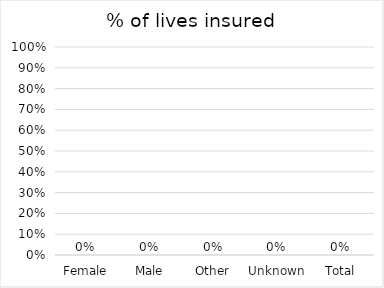
| Category | % of lives insured |
|---|---|
| Female | 0 |
| Male | 0 |
| Other | 0 |
| Unknown | 0 |
| Total | 0 |